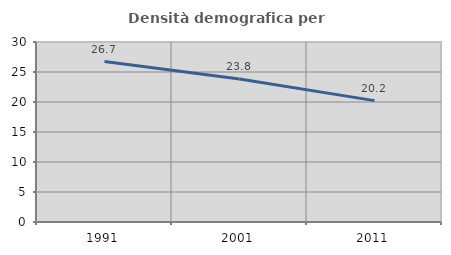
| Category | Densità demografica |
|---|---|
| 1991.0 | 26.733 |
| 2001.0 | 23.843 |
| 2011.0 | 20.231 |